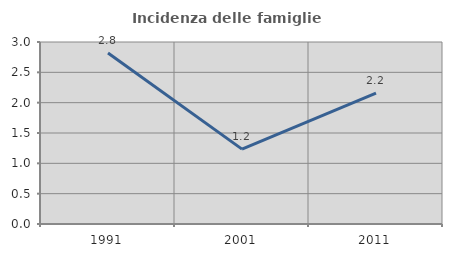
| Category | Incidenza delle famiglie numerose |
|---|---|
| 1991.0 | 2.82 |
| 2001.0 | 1.235 |
| 2011.0 | 2.156 |